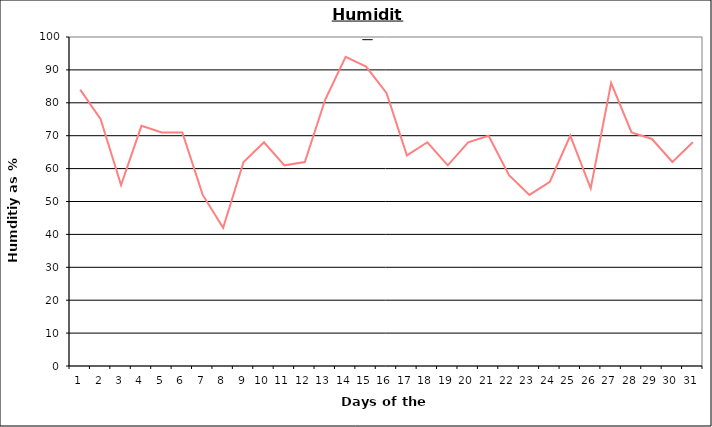
| Category | Series 0 |
|---|---|
| 0 | 84 |
| 1 | 75 |
| 2 | 55 |
| 3 | 73 |
| 4 | 71 |
| 5 | 71 |
| 6 | 52 |
| 7 | 42 |
| 8 | 62 |
| 9 | 68 |
| 10 | 61 |
| 11 | 62 |
| 12 | 81 |
| 13 | 94 |
| 14 | 91 |
| 15 | 83 |
| 16 | 64 |
| 17 | 68 |
| 18 | 61 |
| 19 | 68 |
| 20 | 70 |
| 21 | 58 |
| 22 | 52 |
| 23 | 56 |
| 24 | 70 |
| 25 | 54 |
| 26 | 86 |
| 27 | 71 |
| 28 | 69 |
| 29 | 62 |
| 30 | 68 |